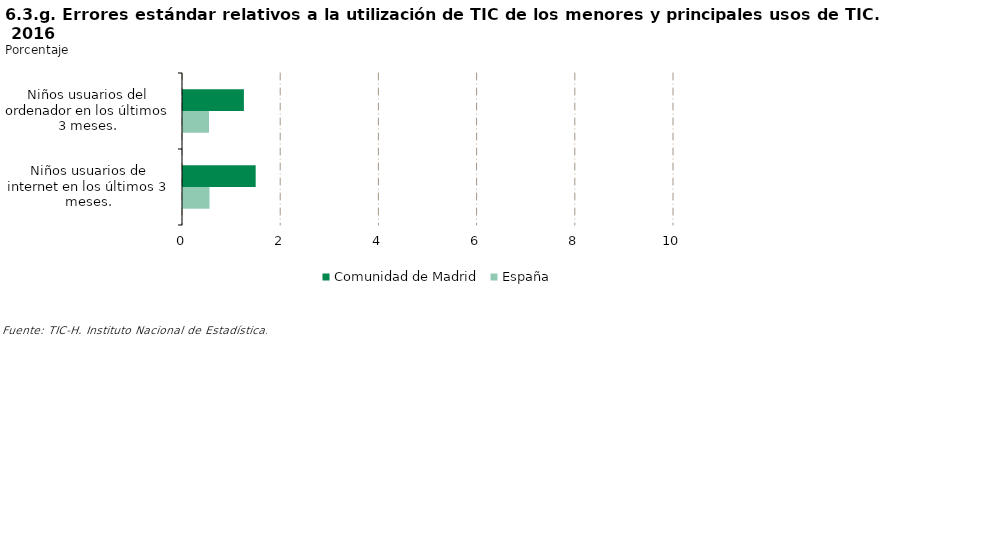
| Category | Comunidad de Madrid | España |
|---|---|---|
| Niños usuarios del ordenador en los últimos 3 meses. | 1.24 | 0.53 |
| Niños usuarios de internet en los últimos 3 meses. | 1.48 | 0.54 |